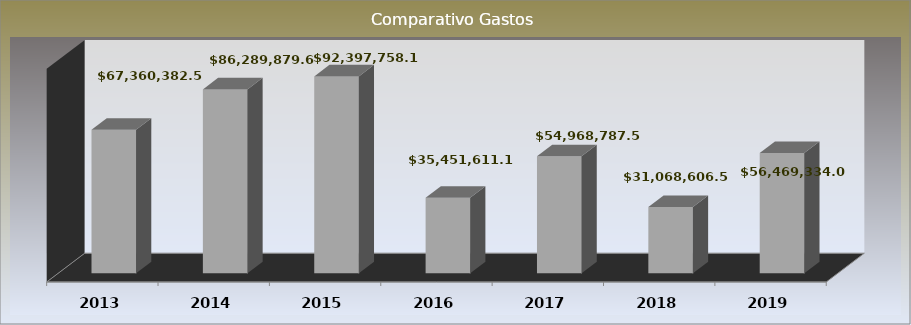
| Category | Series 0 |
|---|---|
| 2013.0 | 67360382.57 |
| 2014.0 | 86289879.62 |
| 2015.0 | 92397758.15 |
| 2016.0 | 35451611.18 |
| 2017.0 | 54968787.54 |
| 2018.0 | 31068606.51 |
| 2019.0 | 56469334 |